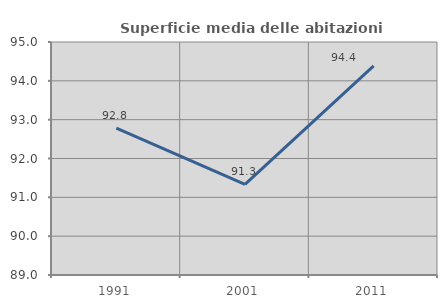
| Category | Superficie media delle abitazioni occupate |
|---|---|
| 1991.0 | 92.781 |
| 2001.0 | 91.333 |
| 2011.0 | 94.385 |